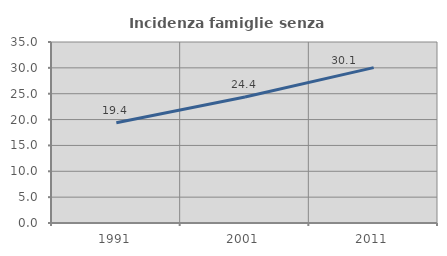
| Category | Incidenza famiglie senza nuclei |
|---|---|
| 1991.0 | 19.374 |
| 2001.0 | 24.363 |
| 2011.0 | 30.05 |